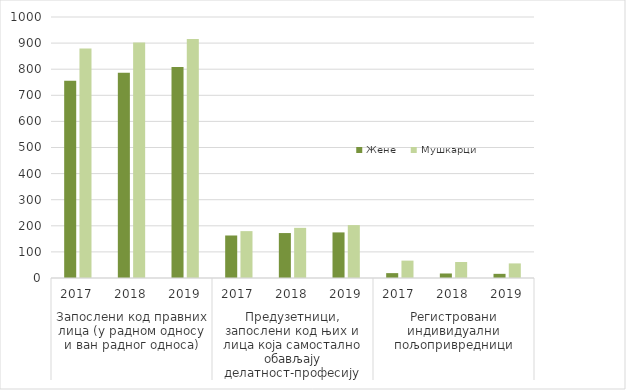
| Category | Жене | Мушкарци |
|---|---|---|
| 0 | 755.887 | 879.014 |
| 1 | 786.073 | 902.168 |
| 2 | 808.314 | 915.514 |
| 3 | 162.871 | 179.586 |
| 4 | 172.196 | 192.11 |
| 5 | 174.7 | 202.739 |
| 6 | 18.658 | 66.572 |
| 7 | 17.323 | 61.21 |
| 8 | 15.97 | 55.897 |